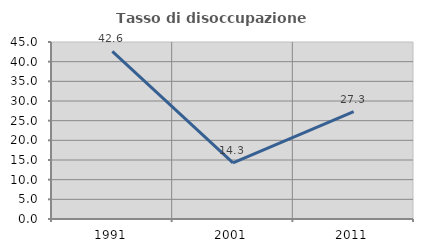
| Category | Tasso di disoccupazione giovanile  |
|---|---|
| 1991.0 | 42.593 |
| 2001.0 | 14.286 |
| 2011.0 | 27.273 |